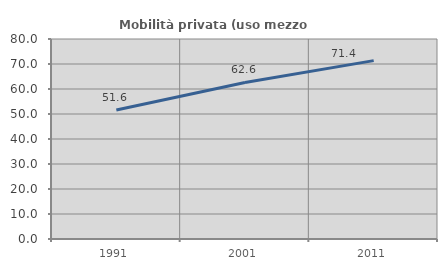
| Category | Mobilità privata (uso mezzo privato) |
|---|---|
| 1991.0 | 51.601 |
| 2001.0 | 62.619 |
| 2011.0 | 71.353 |